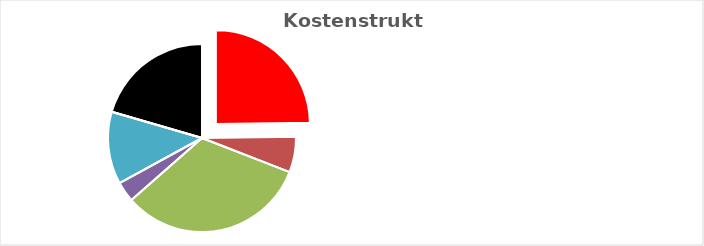
| Category | Series 0 |
|---|---|
| KV-Entgelt produktiv Tätige | 1 |
| Weitere Personalkosten produktiv | 0.247 |
| Personalnebenkosten | 1.316 |
| Unproduktives Personal | 0.142 |
| Deckung Personalgemeinkosten | 0.502 |
| Umlagen ohne GZ | 0 |
| Gesamtzuschlag | 0.828 |